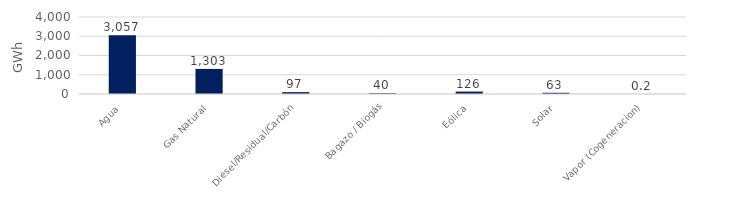
| Category | Series 0 |
|---|---|
| Agua | 3057.47 |
| Gas Natural | 1302.696 |
| Diesel/Residual/Carbón | 96.526 |
| Bagazo / Biogás | 40.01 |
| Eólica | 126.251 |
| Solar | 63.145 |
| Vapor (Cogeneracion) | 0.21 |